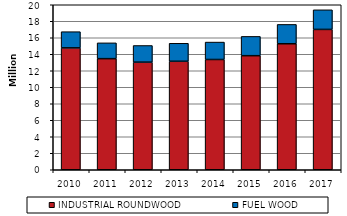
| Category | INDUSTRIAL ROUNDWOOD | FUEL WOOD |
|---|---|---|
| 2010.0 | 14771 | 1965 |
| 2011.0 | 13467 | 1914 |
| 2012.0 | 13041 | 2020 |
| 2013.0 | 13149 | 2182 |
| 2014.0 | 13365 | 2111 |
| 2015.0 | 13827 | 2336 |
| 2016.0 | 15273 | 2344 |
| 2017.0 | 17011 | 2376 |